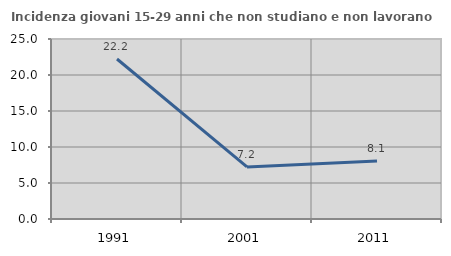
| Category | Incidenza giovani 15-29 anni che non studiano e non lavorano  |
|---|---|
| 1991.0 | 22.222 |
| 2001.0 | 7.233 |
| 2011.0 | 8.068 |